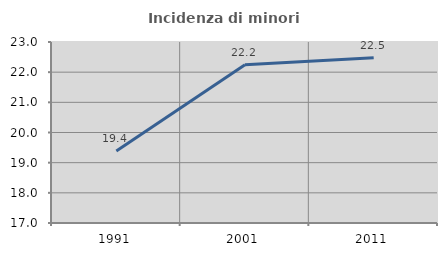
| Category | Incidenza di minori stranieri |
|---|---|
| 1991.0 | 19.388 |
| 2001.0 | 22.242 |
| 2011.0 | 22.477 |